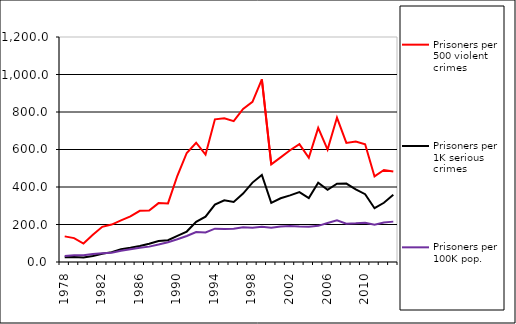
| Category | Prisoners per 500 violent crimes | Prisoners per 1K serious crimes | Prisoners per 100K pop. |
|---|---|---|---|
| 1978.0 | 136.715 | 25.413 | 32.491 |
| 1979.0 | 127.317 | 26.608 | 35.626 |
| 1980.0 | 98.609 | 23.761 | 35.469 |
| 1981.0 | 144.727 | 31.929 | 42.567 |
| 1982.0 | 187.447 | 43.739 | 46.793 |
| 1983.0 | 199.583 | 52.742 | 49.948 |
| 1984.0 | 222.095 | 68.369 | 59.468 |
| 1985.0 | 243.06 | 75.779 | 68.437 |
| 1986.0 | 272.854 | 85.12 | 76.144 |
| 1987.0 | 274.194 | 97.143 | 82.025 |
| 1988.0 | 314.118 | 111.843 | 92.89 |
| 1989.0 | 312.601 | 116.344 | 105.33 |
| 1990.0 | 459.904 | 139.545 | 120.982 |
| 1991.0 | 581.563 | 162.325 | 138.733 |
| 1992.0 | 636.006 | 213.942 | 159.946 |
| 1993.0 | 572.581 | 241.661 | 157.778 |
| 1994.0 | 760.919 | 306.073 | 177.748 |
| 1995.0 | 766.743 | 329.248 | 175.523 |
| 1996.0 | 750.91 | 320.385 | 177.453 |
| 1997.0 | 816.265 | 364.983 | 184.825 |
| 1998.0 | 853.937 | 423.467 | 183.038 |
| 1999.0 | 973.684 | 464.69 | 187.906 |
| 2000.0 | 520.766 | 315.267 | 182.637 |
| 2001.0 | 557.836 | 340.111 | 189.938 |
| 2002.0 | 596.06 | 355.527 | 192.325 |
| 2003.0 | 628.291 | 372.97 | 188.872 |
| 2004.0 | 555.858 | 340.9 | 188.428 |
| 2005.0 | 715.503 | 423.316 | 192.835 |
| 2006.0 | 599.693 | 385.33 | 208.154 |
| 2007.0 | 770.242 | 417.201 | 222.673 |
| 2008.0 | 635.167 | 418.331 | 204.407 |
| 2009.0 | 642.588 | 387.926 | 206.179 |
| 2010.0 | 628.071 | 361.435 | 209.728 |
| 2011.0 | 456.355 | 287 | 198.36 |
| 2012.0 | 491.024 | 316.004 | 211.105 |
| 2013.0 | 482.385 | 359.097 | 215.331 |